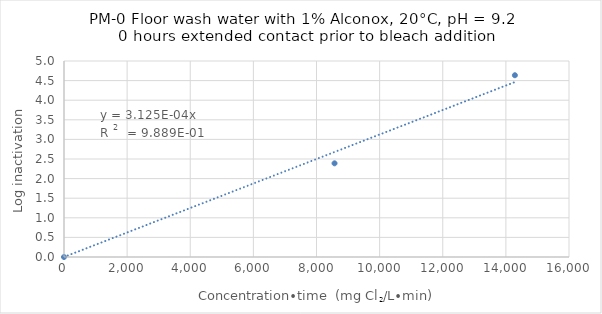
| Category | Series 0 |
|---|---|
| 0.0 | 0 |
| 8571.428571428572 | 2.39 |
| 14285.714285714286 | 4.637 |